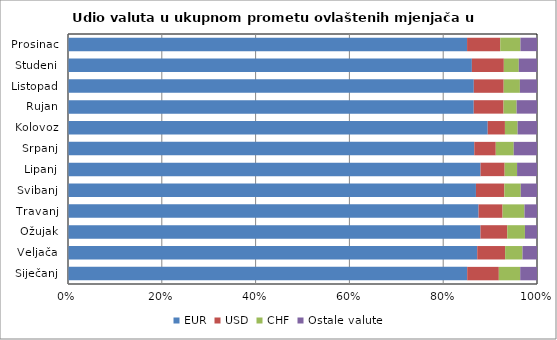
| Category | EUR | USD | CHF | Ostale valute |
|---|---|---|---|---|
| Siječanj | 0.851 | 0.067 | 0.046 | 0.036 |
| Veljača | 0.873 | 0.059 | 0.037 | 0.031 |
| Ožujak | 0.88 | 0.057 | 0.038 | 0.026 |
| Travanj | 0.875 | 0.051 | 0.047 | 0.027 |
| Svibanj | 0.87 | 0.061 | 0.035 | 0.035 |
| Lipanj | 0.88 | 0.051 | 0.027 | 0.042 |
| Srpanj | 0.866 | 0.046 | 0.038 | 0.05 |
| Kolovoz | 0.895 | 0.037 | 0.027 | 0.041 |
| Rujan | 0.865 | 0.064 | 0.028 | 0.043 |
| Listopad | 0.865 | 0.064 | 0.035 | 0.036 |
| Studeni | 0.861 | 0.068 | 0.032 | 0.039 |
| Prosinac | 0.851 | 0.071 | 0.043 | 0.035 |